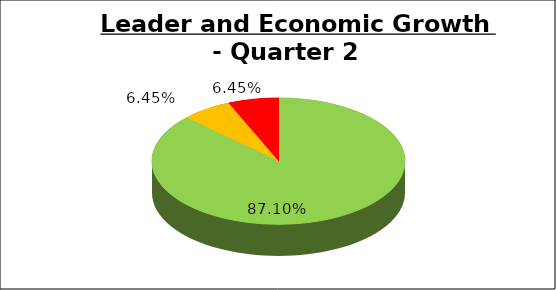
| Category | Q2 |
|---|---|
| Green | 0.871 |
| Amber | 0.065 |
| Red | 0.065 |